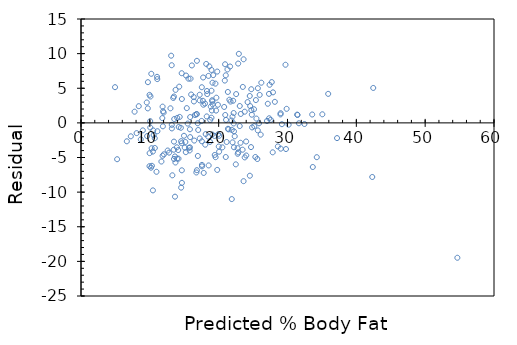
| Category | Series 0 |
|---|---|
| 15.834432861736701 | -3.534 |
| 11.681427980995032 | -5.581 |
| 18.517697151188948 | 6.782 |
| 13.927034617925763 | -3.527 |
| 23.50945345279075 | 5.191 |
| 17.71083422226046 | 3.189 |
| 18.267047258958094 | 0.933 |
| 15.164028880715101 | -2.764 |
| 10.301205208359505 | -6.201 |
| 14.630083847600368 | -2.93 |
| 10.727728859089567 | -3.628 |
| 14.649189972374742 | -6.849 |
| 19.011470616989982 | 1.789 |
| 24.698304025283477 | -3.498 |
| 22.181738810303948 | -0.082 |
| 21.904010670315806 | -1.004 |
| 21.281750379590804 | 7.718 |
| 22.008270173891923 | 0.892 |
| 18.740512038941162 | -2.741 |
| 22.489707076857897 | -5.99 |
| 22.751490970880226 | -3.651 |
| 23.616874835175402 | -8.417 |
| 9.722278363756729 | 5.878 |
| 11.049993006243525 | 6.65 |
| 9.956227253300398 | 4.044 |
| 9.951862813448265 | -6.252 |
| 8.983422006620557 | -1.083 |
| 18.296084824480324 | 4.604 |
| 10.171070018069706 | -6.471 |
| 13.961639184343717 | -5.162 |
| 14.546133029842224 | -2.646 |
| 13.27212907854775 | -7.572 |
| 9.705577361069537 | 2.094 |
| 23.98968779471314 | -2.69 |
| 32.4628424349914 | -0.163 |
| 35.91159552501487 | 4.188 |
| 24.853869097964733 | -0.654 |
| 24.516863265888546 | 3.883 |
| 54.67819035281563 | -19.478 |
| 31.409248249361966 | 1.191 |
| 42.31381472581802 | -7.814 |
| 27.3994718784665 | 5.501 |
| 31.65673626278428 | -0.057 |
| 26.199487304182306 | 5.801 |
| 9.608087419432756 | -1.908 |
| 10.09072688344233 | 3.809 |
| 8.388996720374195 | 2.411 |
| 9.969766377179042 | -4.37 |
| 14.1955880738874 | -0.596 |
| 6.659431552827421 | -2.659 |
| 14.12517638000788 | -3.925 |
| 10.26299295881077 | -3.663 |
| 13.720920732860726 | -5.721 |
| 8.68583098513669 | -2.386 |
| 10.964839627441783 | -7.065 |
| 23.059459237434176 | -0.459 |
| 25.327333877947815 | -4.927 |
| 27.333424624439132 | 0.667 |
| 27.30995405981262 | 4.19 |
| 25.686607713606904 | -1.087 |
| 25.479737071820516 | 0.62 |
| 21.658927778980683 | 8.141 |
| 25.69457983658983 | 5.005 |
| 25.861278911062527 | -0.061 |
| 27.892042783223943 | 4.408 |
| 25.957566291655723 | 4.042 |
| 13.175841697954553 | 8.324 |
| 14.50912334133708 | -0.709 |
| 10.443231157162117 | -4.143 |
| 13.188178260789591 | -0.288 |
| 17.74543878867842 | 6.555 |
| 13.649306477937621 | -4.849 |
| 10.715392296254521 | -2.215 |
| 12.008056568001138 | 1.492 |
| 15.779519609500781 | -3.98 |
| 13.738824296591503 | 4.761 |
| 10.55742210148609 | -1.757 |
| 21.8570695410628 | 0.343 |
| 21.071272054673635 | 0.429 |
| 23.784776470691696 | -4.985 |
| 22.835441788638363 | 8.565 |
| 18.644224658347966 | 8.156 |
| 21.15642543347537 | -2.756 |
| 20.891033856322288 | 6.109 |
| 24.57734351902019 | 2.423 |
| 18.95655736475406 | 7.643 |
| 18.049799372101596 | -3.15 |
| 20.799110915581224 | 2.301 |
| 13.51284753003074 | -5.213 |
| 13.543087656596562 | 0.557 |
| 21.353364634513902 | -0.853 |
| 20.068226681427973 | -1.868 |
| 12.797461737521076 | -4.297 |
| 21.558275958535347 | 3.342 |
| 14.162186068513023 | -5.162 |
| 19.08112555414813 | -1.681 |
| 16.76149954020712 | -7.161 |
| 17.575132031074936 | -6.275 |
| 17.515854338986884 | 0.284 |
| 19.096623995791724 | 3.103 |
| 18.857108105352317 | 2.343 |
| 17.775678915244235 | 2.624 |
| 16.37635001783434 | 3.724 |
| 19.037346303703664 | 3.263 |
| 23.784776470691696 | 1.615 |
| 16.77143098095499 | 1.229 |
| 24.008793919487502 | -4.709 |
| 22.76623265580244 | -4.466 |
| 13.496146527343562 | 3.804 |
| 19.62379946696712 | 1.776 |
| 18.95099036385833 | 0.749 |
| 27.561806513087078 | 0.438 |
| 20.957081110349655 | 1.143 |
| 17.240531321085925 | 4.059 |
| 18.189866003139265 | 8.51 |
| 15.859105987406792 | 0.841 |
| 16.004739619340185 | 4.095 |
| 16.454733834696754 | -2.555 |
| 16.839883357069553 | 8.96 |
| 14.653554412226875 | 3.446 |
| 21.031100487359943 | 6.869 |
| 22.104557554485105 | 3.195 |
| 13.979542748074493 | 0.72 |
| 17.028850435125165 | -1.029 |
| 15.857903426363208 | -2.058 |
| 19.388648016379868 | -1.889 |
| 19.791701102483422 | 7.408 |
| 11.079030571765756 | 6.321 |
| 18.016397366727233 | 2.784 |
| 15.823298859945247 | -0.923 |
| 16.82077723229517 | 1.279 |
| 17.55286402749202 | 5.147 |
| 22.17737437045181 | 1.423 |
| 19.20840981802852 | 6.892 |
| 16.10539143978552 | 8.295 |
| 25.135961677805007 | 1.964 |
| 14.628881286556776 | 7.171 |
| 20.934813106766747 | 8.465 |
| 15.91401923964272 | 6.386 |
| 25.618601141814572 | -5.219 |
| 19.102190996687447 | 5.798 |
| 19.936132173373224 | -1.636 |
| 19.665173595324404 | 3.635 |
| 7.784639993379955 | 1.615 |
| 10.050555316128637 | 0.249 |
| 11.854896617407064 | 2.345 |
| 22.01503973583123 | -2.815 |
| 24.73967815364076 | 4.86 |
| 7.238358397430197 | -1.938 |
| 28.600659013794292 | -3.401 |
| 10.06485119672864 | -0.665 |
| 23.47484888637279 | -3.875 |
| 4.944608070202868 | 5.155 |
| 18.115846626128977 | -1.616 |
| 22.2255180607484 | -1.226 |
| 10.211687389705617 | 7.088 |
| 28.16179880022917 | 3.038 |
| 16.833113795130224 | -6.833 |
| 9.55437672824042 | 2.946 |
| 18.33986407492479 | 4.16 |
| 10.4925774085023 | -1.093 |
| 19.553387773087614 | -4.953 |
| 19.791701102483422 | -6.792 |
| 12.995603499603206 | 2.104 |
| 27.022294479076628 | 0.278 |
| 18.773157287594167 | 0.427 |
| 19.11889199937464 | 2.681 |
| 23.17365018175815 | -2.874 |
| 35.06095334564192 | 1.239 |
| 18.483092584770993 | -1.983 |
| 13.654873478833352 | -10.655 |
| 10.44759559701425 | -9.748 |
| 17.252867883920977 | 3.247 |
| 16.952871740349927 | -0.053 |
| 29.021615663628623 | -3.722 |
| 11.103703697435854 | -1.204 |
| 14.963481996545795 | -1.863 |
| 30.162322545824757 | -0.262 |
| 19.88798848307662 | 2.612 |
| 24.53160495081078 | -7.632 |
| 24.747650276623673 | 1.852 |
| 5.248968653626065 | -5.249 |
| 15.07767294086976 | -3.578 |
| 15.691204351890498 | -3.591 |
| 15.368940204736539 | 2.131 |
| 12.593752974543229 | -3.994 |
| 27.851871215910265 | -4.252 |
| 22.332939443133064 | -1.933 |
| 21.438518013315644 | -0.939 |
| 26.101997362545532 | -1.702 |
| 11.89627074576434 | -0.496 |
| 29.707963890616057 | 8.392 |
| 20.062659680532235 | -4.163 |
| 25.174173927353735 | -0.474 |
| 13.098660442135717 | 9.701 |
| 23.063823677286308 | 2.436 |
| 15.61282053502807 | 6.387 |
| 16.55658821618568 | 1.143 |
| 8.079069136055281 | -1.479 |
| 18.95655736475406 | 4.643 |
| 16.976342304976434 | -4.776 |
| 15.26468070116043 | 6.835 |
| 25.406920255853827 | 3.293 |
| 14.660323974166197 | -8.66 |
| 33.590010193308906 | 1.21 |
| 20.015718551279235 | -3.416 |
| 22.930526608187975 | 9.969 |
| 23.618077396218993 | 9.182 |
| 13.475837841525603 | -3.876 |
| 13.506077968091425 | -2.706 |
| 11.85369405636348 | -4.754 |
| 24.2013686806739 | 2.999 |
| 16.406590144400155 | 3.093 |
| 22.224315499704808 | -3.524 |
| 14.269607450897674 | 5.23 |
| 42.45584067462063 | 5.044 |
| 11.92651087233017 | 1.673 |
| 12.040701816654142 | -4.541 |
| 23.2094573092197 | 1.291 |
| 17.246098321981655 | -2.246 |
| 18.54357283790263 | -6.144 |
| 29.778375584495564 | -3.778 |
| 17.5695650301792 | -6.07 |
| 14.549294908650765 | -9.349 |
| 21.905213231359397 | -11.005 |
| 11.811117366962606 | 0.689 |
| 19.43122470578073 | -4.631 |
| 19.529917208461114 | 5.67 |
| 17.55843102838776 | -2.658 |
| 20.536124460515317 | -3.536 |
| 17.82698448434939 | -7.227 |
| 21.02989792631635 | -4.93 |
| 15.49983215174769 | -0.1 |
| 22.54101264596305 | 4.159 |
| 21.334258509739534 | 4.466 |
| 22.85334535236914 | -4.253 |
| 21.72061059315591 | 3.079 |
| 33.67396101106705 | -6.374 |
| 13.199312262581053 | -0.799 |
| 27.13964730220914 | 2.76 |
| 13.401818464515316 | 3.598 |
| 37.197936039144395 | -2.198 |
| 29.003712099897847 | 1.396 |
| 31.459797061745753 | 1.14 |
| 29.188314738101333 | -0.188 |
| 14.340019144777187 | 0.86 |
| 28.97903897422775 | 1.221 |
| 15.227671012655286 | -4.228 |
| 27.711804584872603 | 5.888 |
| 34.254847173434776 | -4.955 |
| 24.81806197050318 | 1.182 |
| 29.873460404045176 | 2.027 |